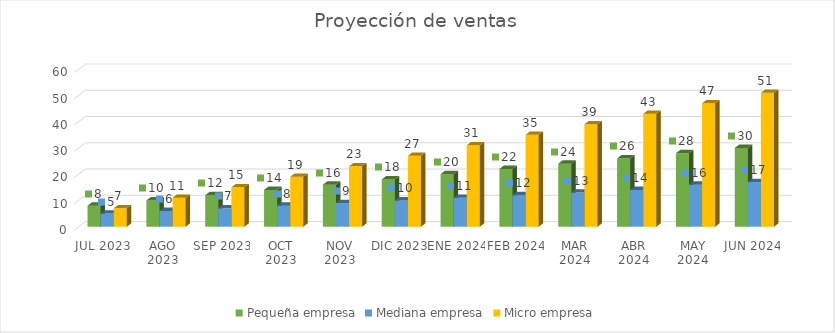
| Category | Pequeña empresa | Mediana empresa | Micro empresa |
|---|---|---|---|
| JUL 2023 | 8 | 5 | 7 |
| AGO 2023 | 10 | 6 | 11 |
| SEP 2023 | 12 | 7 | 15 |
| OCT 2023 | 14 | 8 | 19 |
| NOV 2023 | 16 | 9 | 23 |
| DIC 2023 | 18 | 10 | 27 |
| ENE 2024 | 20 | 11 | 31 |
| FEB 2024 | 22 | 12 | 35 |
| MAR 2024 | 24 | 13 | 39 |
| ABR 2024 | 26 | 14 | 43 |
| MAY 2024 | 28 | 16 | 47 |
| JUN 2024 | 30 | 17 | 51 |